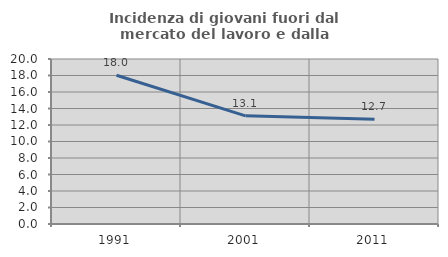
| Category | Incidenza di giovani fuori dal mercato del lavoro e dalla formazione  |
|---|---|
| 1991.0 | 18.031 |
| 2001.0 | 13.108 |
| 2011.0 | 12.696 |